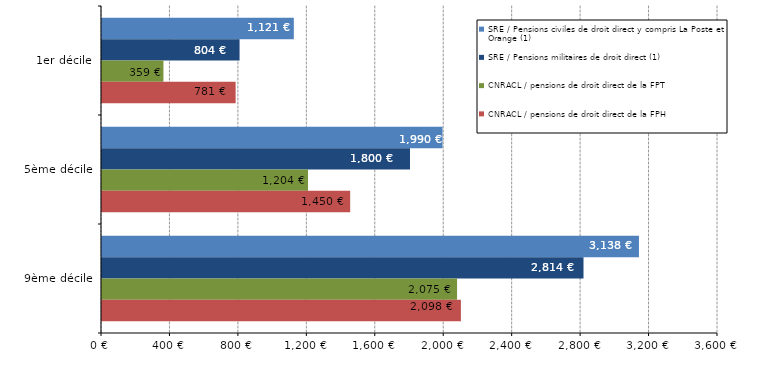
| Category | SRE / Pensions civiles de droit direct y compris La Poste et Orange (1) | SRE / Pensions militaires de droit direct (1) | CNRACL / pensions de droit direct de la FPT | CNRACL / pensions de droit direct de la FPH |
|---|---|---|---|---|
| 1er décile | 1121 | 804 | 359 | 780.9 |
| 5ème décile | 1990 | 1800 | 1204 | 1450.3 |
| 9ème décile | 3138 | 2814 | 2075 | 2097.5 |